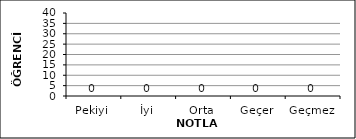
| Category | Series 0 |
|---|---|
| Pekiyi | 0 |
| İyi | 0 |
| Orta | 0 |
| Geçer | 0 |
| Geçmez | 0 |